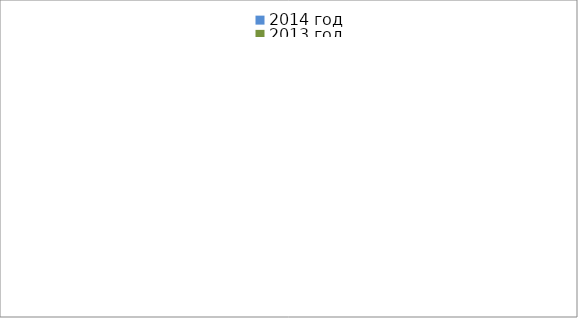
| Category | 2014 год | 2013 год |
|---|---|---|
|  - поджог | 0 | 0 |
|  - неосторожное обращение с огнём | 2 | 0 |
|  - НПТЭ электрооборудования | 2 | 0 |
|  - НПУ и Э печей | 4 | 1 |
|  - НПУ и Э транспортных средств | 5 | 1 |
|   -Шалость с огнем детей | 0 | 0 |
|  -НППБ при эксплуатации эл.приборов | 1 | 0 |
|  - курение | 0 | 0 |
| - прочие | 0 | 2 |
| - не установленные причины | 0 | 0 |